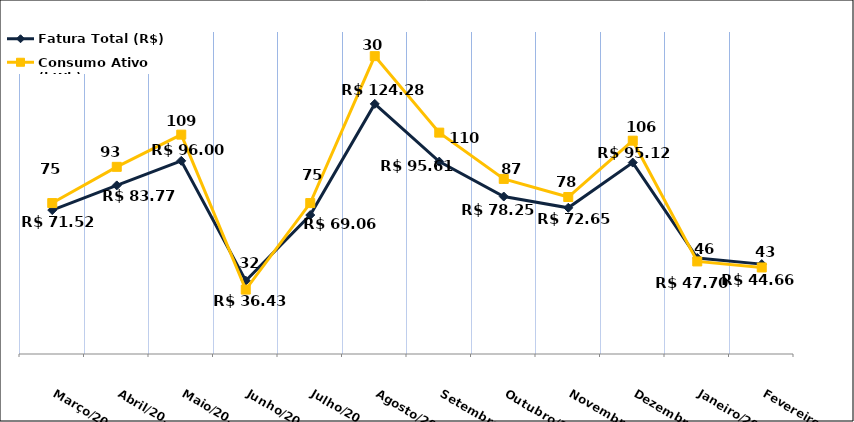
| Category | Fatura Total (R$) |
|---|---|
| Março/2023 | 71.52 |
| Abril/2023 | 83.77 |
| Maio/2023 | 96 |
| Junho/2023 | 36.43 |
| Julho/2023 | 69.06 |
| Agosto/2023 | 124.28 |
| Setembro/2023 | 95.61 |
| Outubro/2023 | 78.25 |
| Novembro/2023 | 72.65 |
| Dezembro/2023 | 95.12 |
| Janeiro/2024 | 47.7 |
| Fevereiro/2024 | 44.66 |